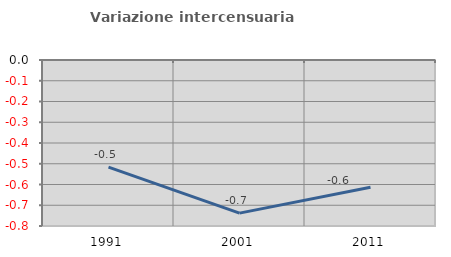
| Category | Variazione intercensuaria annua |
|---|---|
| 1991.0 | -0.516 |
| 2001.0 | -0.738 |
| 2011.0 | -0.613 |